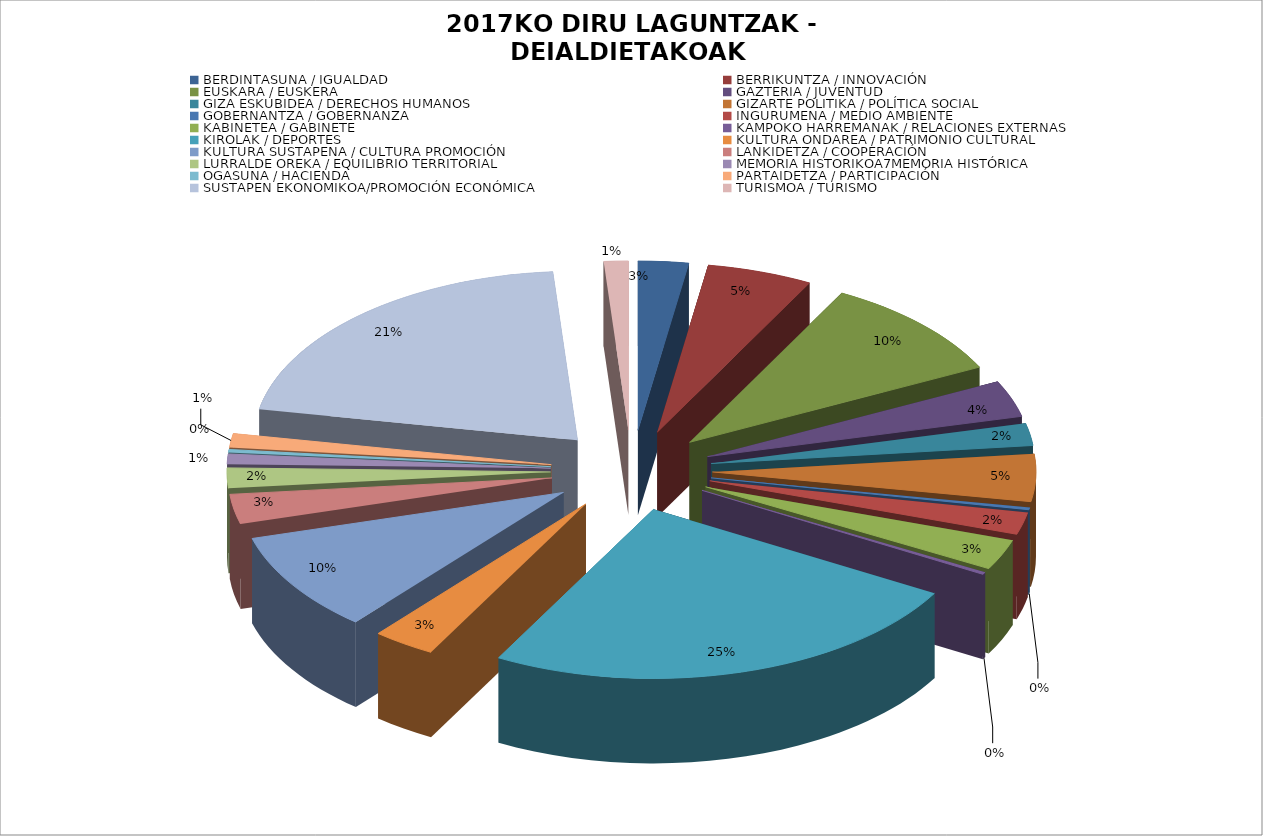
| Category |  ESKAERAK / SOLICITUDES | EZETZIAK / DENEGADAS |  GUZTIRA / TOTAL |
|---|---|---|---|
| BERDINTASUNA / IGUALDAD | 99 | 13 | 449938 |
| BERRIKUNTZA / INNOVACIÓN | 208 | 120 | 2728104 |
| EUSKARA / EUSKERA | 389 | 74 | 2658742 |
| GAZTERIA / JUVENTUD | 138 | 8 | 741176.34 |
| GIZA ESKUBIDEA / DERECHOS HUMANOS | 84 | 21 | 460000 |
| GIZARTE POLITIKA / POLÍTICA SOCIAL | 178 | 29 | 1198606 |
| GOBERNANTZA / GOBERNANZA | 8 | 0 | 117000 |
| INGURUMENA / MEDIO AMBIENTE | 83 | 26 | 527661.83 |
| KABINETEA / GABINETE | 115 | 94 | 720000 |
| KAMPOKO HARREMANAK / RELACIONES EXTERNAS | 9 | 1 | 26329.96 |
| KIROLAK / DEPORTES | 972 | 363 | 12904243.08 |
| KULTURA ONDAREA / PATRIMONIO CULTURAL | 124 | 23 | 1051091.49 |
| KULTURA SUSTAPENA / CULTURA PROMOCIÓN | 375 | 118 | 1884996.68 |
| LANKIDETZA / COOPERACIÓN | 112 | 49 | 3629295.62 |
| LURRALDE OREKA / EQUILIBRIO TERRITORIAL | 76 | 9 | 1673748.97 |
| MEMORIA HISTORIKOA7MEMORIA HISTÓRICA | 38 | 8 | 132200 |
| OGASUNA / HACIENDA | 11 | 9 | 2250 |
| PARTAIDETZA / PARTICIPACIÓN | 52 | 3 | 170000 |
| SUSTAPEN EKONOMIKOA/PROMOCIÓN ECONÓMICA | 821 | 168 | 9477398.86 |
| TURISMOA / TURISMO | 48 | 12 | 355194.9 |